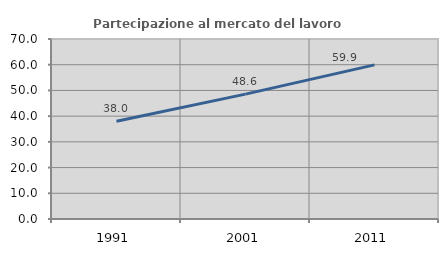
| Category | Partecipazione al mercato del lavoro  femminile |
|---|---|
| 1991.0 | 38.041 |
| 2001.0 | 48.56 |
| 2011.0 | 59.933 |